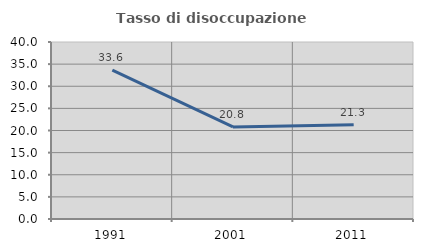
| Category | Tasso di disoccupazione giovanile  |
|---|---|
| 1991.0 | 33.645 |
| 2001.0 | 20.8 |
| 2011.0 | 21.311 |